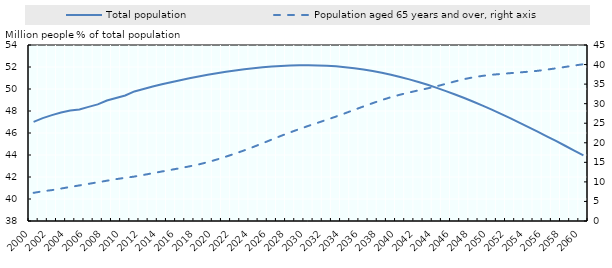
| Category | Total population |
|---|---|
| 2000.0 | 47.008 |
| 2001.0 | 47.357 |
| 2002.0 | 47.622 |
| 2003.0 | 47.859 |
| 2004.0 | 48.039 |
| 2005.0 | 48.138 |
| 2006.0 | 48.372 |
| 2007.0 | 48.598 |
| 2008.0 | 48.949 |
| 2009.0 | 49.182 |
| 2010.0 | 49.41 |
| 2011.0 | 49.779 |
| 2012.0 | 50.004 |
| 2013.0 | 50.22 |
| 2014.0 | 50.424 |
| 2015.0 | 50.617 |
| 2016.0 | 50.801 |
| 2017.0 | 50.977 |
| 2018.0 | 51.141 |
| 2019.0 | 51.294 |
| 2020.0 | 51.435 |
| 2021.0 | 51.566 |
| 2022.0 | 51.686 |
| 2023.0 | 51.791 |
| 2024.0 | 51.888 |
| 2025.0 | 51.972 |
| 2026.0 | 52.042 |
| 2027.0 | 52.094 |
| 2028.0 | 52.131 |
| 2029.0 | 52.154 |
| 2030.0 | 52.16 |
| 2031.0 | 52.146 |
| 2032.0 | 52.115 |
| 2033.0 | 52.06 |
| 2034.0 | 51.985 |
| 2035.0 | 51.888 |
| 2036.0 | 51.771 |
| 2037.0 | 51.632 |
| 2038.0 | 51.47 |
| 2039.0 | 51.291 |
| 2040.0 | 51.091 |
| 2041.0 | 50.873 |
| 2042.0 | 50.636 |
| 2043.0 | 50.38 |
| 2044.0 | 50.102 |
| 2045.0 | 49.81 |
| 2046.0 | 49.502 |
| 2047.0 | 49.181 |
| 2048.0 | 48.841 |
| 2049.0 | 48.488 |
| 2050.0 | 48.121 |
| 2051.0 | 47.741 |
| 2052.0 | 47.353 |
| 2053.0 | 46.952 |
| 2054.0 | 46.541 |
| 2055.0 | 46.125 |
| 2056.0 | 45.703 |
| 2057.0 | 45.275 |
| 2058.0 | 44.842 |
| 2059.0 | 44.403 |
| 2060.0 | 43.959 |